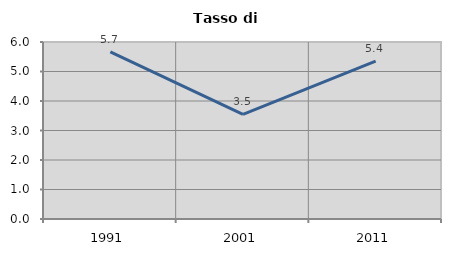
| Category | Tasso di disoccupazione   |
|---|---|
| 1991.0 | 5.667 |
| 2001.0 | 3.548 |
| 2011.0 | 5.35 |